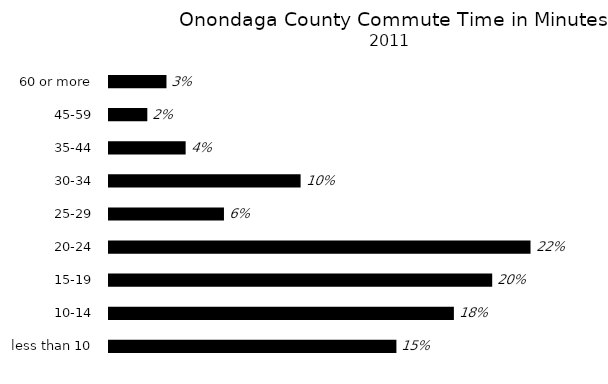
| Category | Series 0 |
|---|---|
| less than 10 | 0.15 |
| 10-14 | 0.18 |
| 15-19 | 0.2 |
| 20-24 | 0.22 |
| 25-29 | 0.06 |
| 30-34 | 0.1 |
| 35-44 | 0.04 |
| 45-59 | 0.02 |
| 60 or more | 0.03 |